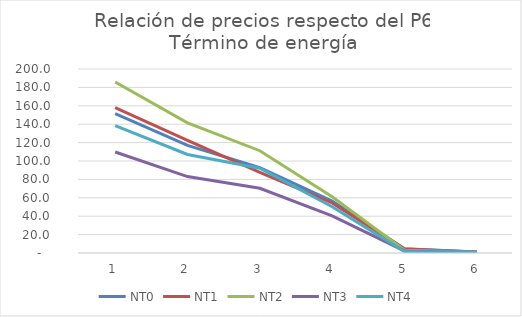
| Category | NT0 | NT1 | NT2 | NT3 | NT4 |
|---|---|---|---|---|---|
| 0 | 151.388 | 157.935 | 185.868 | 109.83 | 138.539 |
| 1 | 117.054 | 122.346 | 141.416 | 83.094 | 107.141 |
| 2 | 92.894 | 87.538 | 111.172 | 70.31 | 92.177 |
| 3 | 56.419 | 54.361 | 61.206 | 40.413 | 50.267 |
| 4 | 4.518 | 4.438 | 2.993 | 2.275 | 1.621 |
| 5 | 1 | 1 | 1 | 1 | 1 |